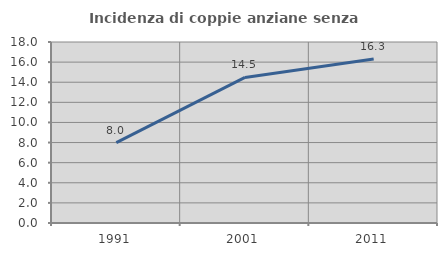
| Category | Incidenza di coppie anziane senza figli  |
|---|---|
| 1991.0 | 8 |
| 2001.0 | 14.474 |
| 2011.0 | 16.304 |